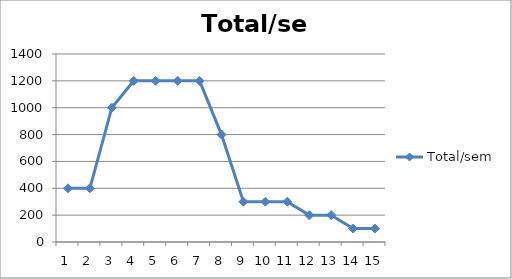
| Category | Total/sem |
|---|---|
| 0 | 400 |
| 1 | 400 |
| 2 | 1000 |
| 3 | 1200 |
| 4 | 1200 |
| 5 | 1200 |
| 6 | 1200 |
| 7 | 800 |
| 8 | 300 |
| 9 | 300 |
| 10 | 300 |
| 11 | 200 |
| 12 | 200 |
| 13 | 100 |
| 14 | 100 |